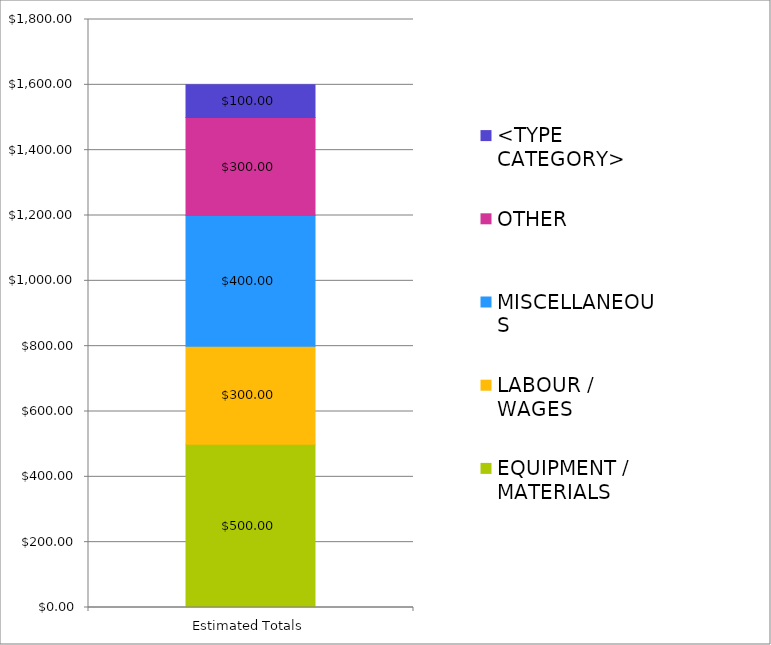
| Category | EQUIPMENT / MATERIALS | LABOUR / WAGES | MISCELLANEOUS | OTHER | <TYPE CATEGORY> |
|---|---|---|---|---|---|
| Estimated Totals | 500 | 300 | 400 | 300 | 100 |